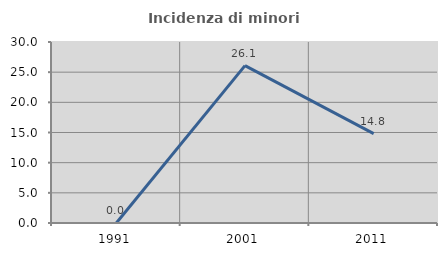
| Category | Incidenza di minori stranieri |
|---|---|
| 1991.0 | 0 |
| 2001.0 | 26.087 |
| 2011.0 | 14.815 |